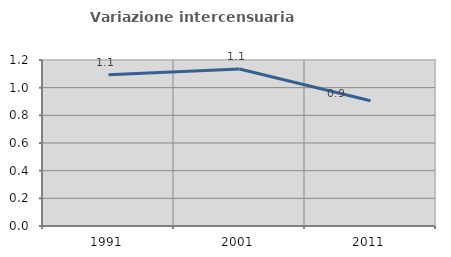
| Category | Variazione intercensuaria annua |
|---|---|
| 1991.0 | 1.093 |
| 2001.0 | 1.135 |
| 2011.0 | 0.905 |